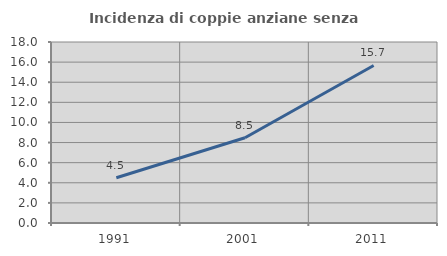
| Category | Incidenza di coppie anziane senza figli  |
|---|---|
| 1991.0 | 4.496 |
| 2001.0 | 8.481 |
| 2011.0 | 15.67 |